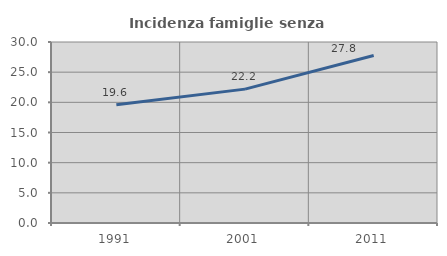
| Category | Incidenza famiglie senza nuclei |
|---|---|
| 1991.0 | 19.585 |
| 2001.0 | 22.19 |
| 2011.0 | 27.77 |